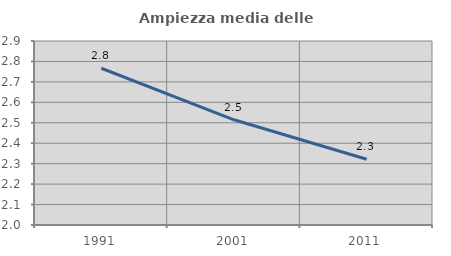
| Category | Ampiezza media delle famiglie |
|---|---|
| 1991.0 | 2.767 |
| 2001.0 | 2.515 |
| 2011.0 | 2.322 |